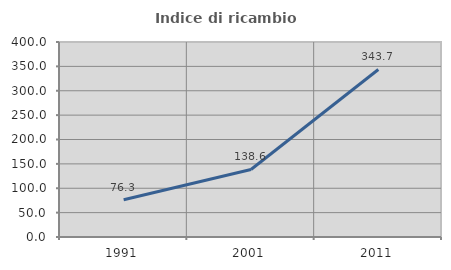
| Category | Indice di ricambio occupazionale  |
|---|---|
| 1991.0 | 76.289 |
| 2001.0 | 138.554 |
| 2011.0 | 343.662 |